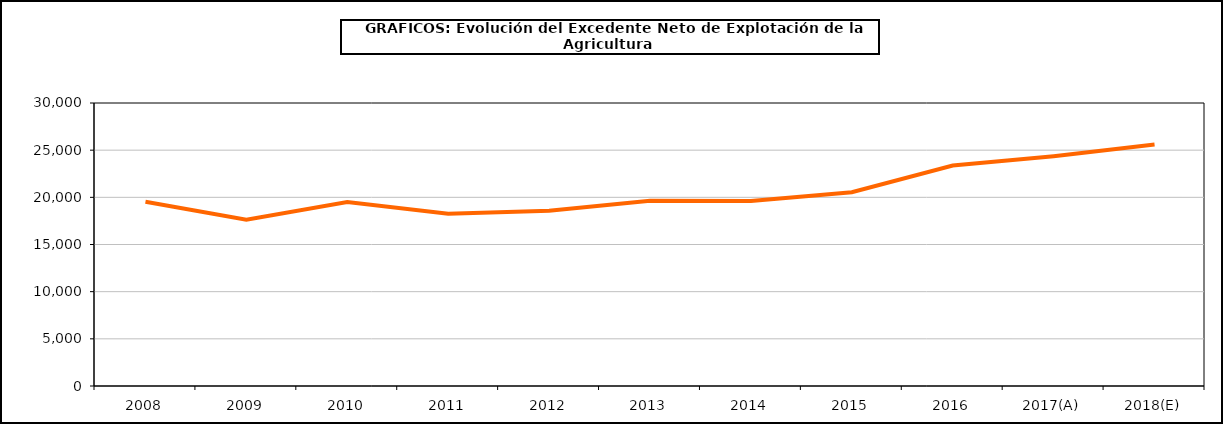
| Category | excedente neto de explotacion |
|---|---|
| 2008 | 19538.087 |
| 2009 | 17624.014 |
| 2010 | 19508.768 |
| 2011 | 18252.686 |
| 2012 | 18589.082 |
| 2013 | 19635.617 |
| 2014 | 19616.041 |
| 2015 | 20539.815 |
| 2016 | 23367.672 |
| 2017(A) | 24366.13 |
| 2018(E) | 25594.07 |